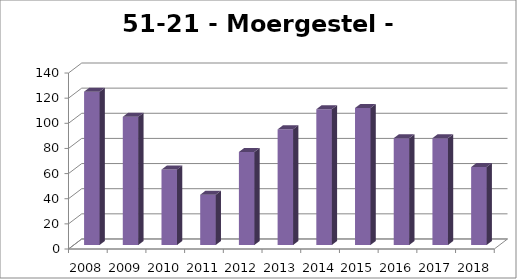
| Category | Moergestel - Haghorst |
|---|---|
| 2008.0 | 122 |
| 2009.0 | 102 |
| 2010.0 | 60 |
| 2011.0 | 40 |
| 2012.0 | 74 |
| 2013.0 | 92 |
| 2014.0 | 108 |
| 2015.0 | 109 |
| 2016.0 | 85 |
| 2017.0 | 85 |
| 2018.0 | 62 |